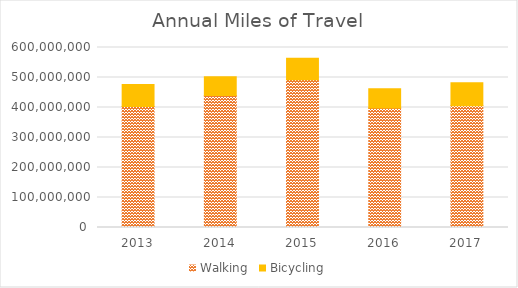
| Category | Walking | Bicycling |
|---|---|---|
| 2013 | 403151877.317 | 73861457.524 |
| 2014 | 439630325.763 | 62544988.203 |
| 2015 | 492298379.455 | 71459827.84 |
| 2016 | 398217871.759 | 63870768.985 |
| 2017 | 405509149.095 | 77205593.896 |